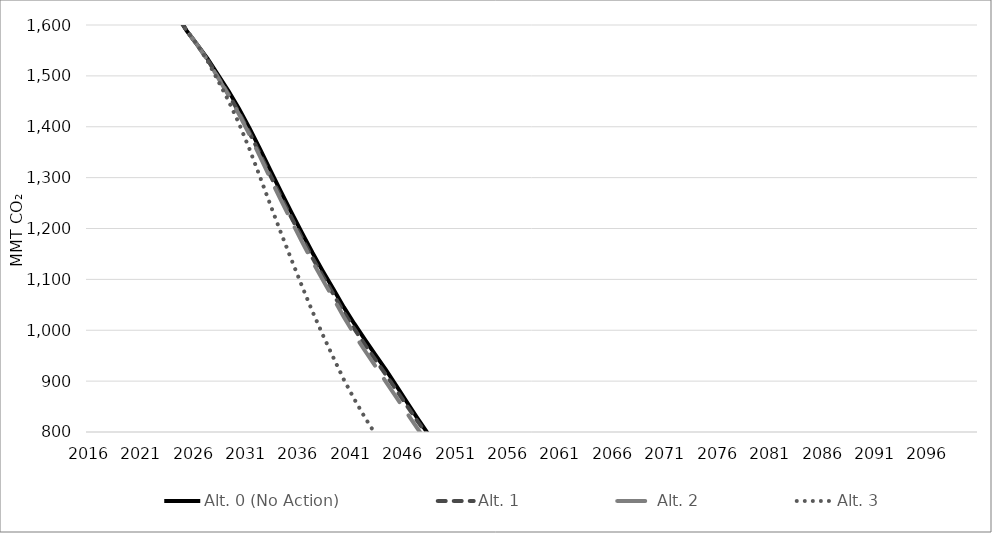
| Category | Alt. 0 (No Action) | Alt. 1 | Alt. 2 | Alt. 3 |
|---|---|---|---|---|
| 2016.0 | 1835.056 | 1835.056 | 1835.056 | 1835.056 |
| 2017.0 | 1806.467 | 1806.467 | 1806.467 | 1806.467 |
| 2018.0 | 1777.878 | 1777.878 | 1777.878 | 1777.878 |
| 2019.0 | 1749.289 | 1749.289 | 1749.289 | 1749.289 |
| 2020.0 | 1720.701 | 1720.701 | 1720.701 | 1720.701 |
| 2021.0 | 1692.112 | 1692.112 | 1692.112 | 1692.112 |
| 2022.0 | 1623.069 | 1623.069 | 1623.069 | 1623.069 |
| 2023.0 | 1635.871 | 1635.871 | 1635.871 | 1635.871 |
| 2024.0 | 1621.953 | 1621.953 | 1621.953 | 1621.953 |
| 2025.0 | 1588.984 | 1588.984 | 1588.984 | 1588.984 |
| 2026.0 | 1561.613 | 1561.613 | 1561.613 | 1561.613 |
| 2027.0 | 1533.691 | 1531.689 | 1531.04 | 1529.292 |
| 2028.0 | 1502.036 | 1497.995 | 1496.49 | 1490.697 |
| 2029.0 | 1470.243 | 1464.155 | 1461.787 | 1451.118 |
| 2030.0 | 1435.196 | 1427.873 | 1424.579 | 1406.307 |
| 2031.0 | 1397.193 | 1388.586 | 1384.42 | 1356.074 |
| 2032.0 | 1356.525 | 1346.615 | 1341.526 | 1301.697 |
| 2033.0 | 1314.161 | 1303.922 | 1298.26 | 1246.148 |
| 2034.0 | 1272.244 | 1262.004 | 1255.754 | 1191.687 |
| 2035.0 | 1231.684 | 1221.471 | 1214.703 | 1139.039 |
| 2036.0 | 1191.882 | 1181.508 | 1174.426 | 1087.216 |
| 2037.0 | 1152.893 | 1142.631 | 1135.245 | 1037.249 |
| 2038.0 | 1116.25 | 1106.347 | 1098.882 | 990.728 |
| 2039.0 | 1080.985 | 1071.171 | 1062.8 | 946.348 |
| 2040.0 | 1045.442 | 1035.298 | 1025.994 | 903.106 |
| 2041.0 | 1012.862 | 1002.746 | 992.067 | 864.579 |
| 2042.0 | 981.946 | 971.834 | 960.165 | 828.972 |
| 2043.0 | 952.232 | 942.336 | 929.841 | 796.291 |
| 2044.0 | 922.674 | 912.867 | 899.223 | 763.992 |
| 2045.0 | 891.394 | 882.69 | 868.372 | 733.32 |
| 2046.0 | 859.458 | 852.214 | 837.803 | 704.765 |
| 2047.0 | 827.841 | 822.083 | 807.55 | 677.25 |
| 2048.0 | 797.565 | 793.248 | 778.675 | 651.207 |
| 2049.0 | 765.882 | 762.824 | 748.373 | 625.638 |
| 2050.0 | 733.401 | 731.361 | 717.341 | 600.312 |
| 2051.0 | 733.024 | 730.985 | 716.972 | 600.004 |
| 2052.0 | 732.647 | 730.609 | 716.603 | 599.695 |
| 2053.0 | 732.27 | 730.233 | 716.235 | 599.387 |
| 2054.0 | 731.893 | 729.858 | 715.866 | 599.078 |
| 2055.0 | 731.516 | 729.482 | 715.497 | 598.77 |
| 2056.0 | 731.139 | 729.106 | 715.129 | 598.461 |
| 2057.0 | 730.762 | 728.73 | 714.76 | 598.153 |
| 2058.0 | 730.385 | 728.354 | 714.391 | 597.844 |
| 2059.0 | 730.008 | 727.978 | 714.023 | 597.536 |
| 2060.0 | 729.631 | 727.602 | 713.654 | 597.227 |
| 2061.0 | 729.255 | 727.226 | 713.285 | 596.919 |
| 2062.0 | 728.878 | 726.851 | 712.917 | 596.61 |
| 2063.0 | 728.501 | 726.475 | 712.548 | 596.302 |
| 2064.0 | 728.124 | 726.099 | 712.179 | 595.993 |
| 2065.0 | 727.747 | 725.723 | 711.811 | 595.685 |
| 2066.0 | 727.529 | 725.506 | 711.598 | 595.507 |
| 2067.0 | 727.312 | 725.289 | 711.385 | 595.329 |
| 2068.0 | 727.095 | 725.073 | 711.173 | 595.151 |
| 2069.0 | 726.877 | 724.856 | 710.96 | 594.973 |
| 2070.0 | 726.66 | 724.639 | 710.747 | 594.795 |
| 2071.0 | 726.442 | 724.422 | 710.535 | 594.617 |
| 2072.0 | 726.225 | 724.205 | 710.322 | 594.439 |
| 2073.0 | 726.008 | 723.989 | 710.11 | 594.261 |
| 2074.0 | 725.79 | 723.772 | 709.897 | 594.083 |
| 2075.0 | 725.573 | 723.555 | 709.684 | 593.905 |
| 2076.0 | 725.355 | 723.338 | 709.472 | 593.727 |
| 2077.0 | 725.138 | 723.121 | 709.259 | 593.549 |
| 2078.0 | 724.921 | 722.905 | 709.046 | 593.371 |
| 2079.0 | 724.703 | 722.688 | 708.834 | 593.193 |
| 2080.0 | 724.486 | 722.471 | 708.621 | 593.015 |
| 2081.0 | 721.109 | 719.104 | 705.318 | 590.251 |
| 2082.0 | 717.733 | 715.737 | 702.016 | 587.488 |
| 2083.0 | 714.356 | 712.369 | 698.713 | 584.724 |
| 2084.0 | 710.98 | 709.002 | 695.411 | 581.96 |
| 2085.0 | 707.603 | 705.635 | 692.108 | 579.196 |
| 2086.0 | 704.226 | 702.268 | 688.805 | 576.432 |
| 2087.0 | 700.85 | 698.901 | 685.503 | 573.669 |
| 2088.0 | 697.473 | 695.534 | 682.2 | 570.905 |
| 2089.0 | 694.097 | 692.167 | 678.898 | 568.141 |
| 2090.0 | 690.72 | 688.799 | 675.595 | 565.377 |
| 2091.0 | 687.344 | 685.432 | 672.292 | 562.613 |
| 2092.0 | 683.967 | 682.065 | 668.99 | 559.85 |
| 2093.0 | 680.591 | 678.698 | 665.687 | 557.086 |
| 2094.0 | 677.214 | 675.331 | 662.385 | 554.322 |
| 2095.0 | 673.838 | 671.964 | 659.082 | 551.558 |
| 2096.0 | 673.838 | 671.964 | 659.082 | 551.558 |
| 2097.0 | 673.838 | 671.964 | 659.082 | 551.558 |
| 2098.0 | 673.838 | 671.964 | 659.082 | 551.558 |
| 2099.0 | 673.838 | 671.964 | 659.082 | 551.558 |
| 2100.0 | 673.838 | 671.964 | 659.082 | 551.558 |